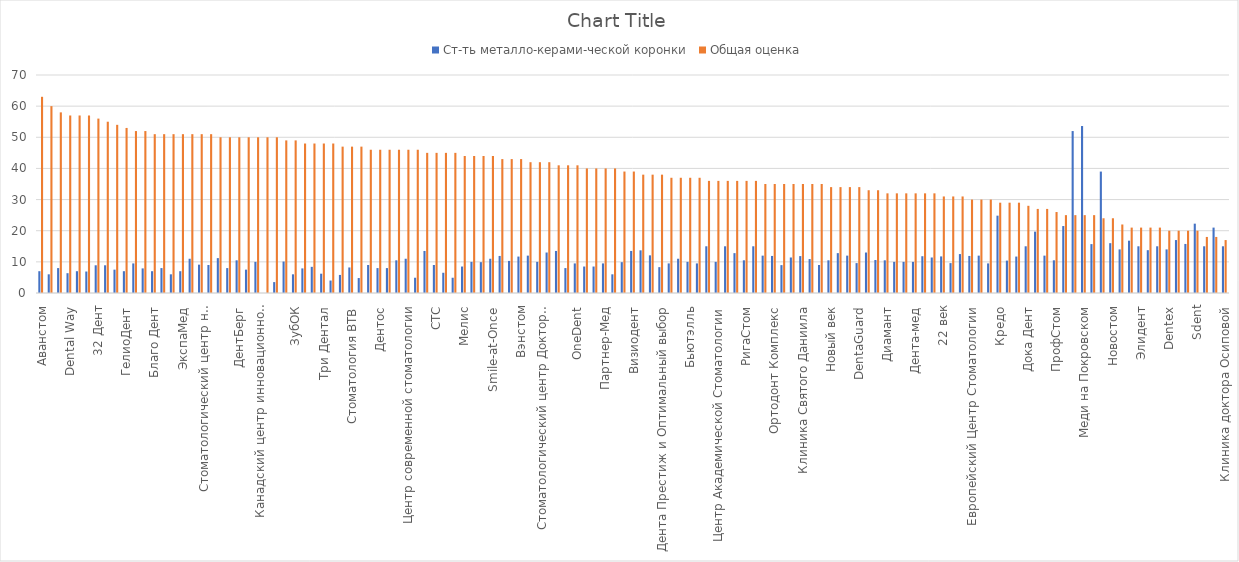
| Category | Ст-ть металло-керами-ческой коронки | Общая оценка |
|---|---|---|
| Аванстом | 7 | 63 |
| Habbydent32 | 6 | 60 |
| Smiles Clinic | 8 | 58 |
| Dental Way | 6.36 | 57 |
| Дантист | 7 | 57 |
| Добрый доктор | 6.9 | 57 |
| 32 Дент | 8.9 | 56 |
| Implant City | 8.9 | 55 |
| Дента Лэнд | 7.5 | 54 |
| ГелиоДент | 7 | 53 |
| Менделеев | 9.5 | 52 |
| С вами доктор на Киевской | 7.9 | 52 |
| Благо Дент | 7 | 51 |
| Зууб.рф | 8 | 51 |
| Стомат-Эффект | 6 | 51 |
| ЭкспаМед | 7 | 51 |
| Инновационный центр клинической стоматологии "Дежавю" | 11 | 51 |
| Art Dental Clinic | 9.1 | 51 |
| Стоматологический центр на Серпуховской | 9 | 51 |
| Дентастиль | 11.2 | 50 |
| Доктор Маг | 8 | 50 |
| ДентБерг | 10.5 | 50 |
| Старс Дентал | 7.5 | 50 |
| ЛюмиДЕНТ | 10 | 50 |
| Канадский центр инновационной стоматологии и косметологии | 0 | 50 |
| Институт инновационной медицины | 3.5 | 50 |
| НоваДент | 10.1 | 49 |
| ЗубОК | 6 | 49 |
| Eurodent | 7.9 | 48 |
| Стомдом | 8.4 | 48 |
| Три Дентал | 6.2 | 48 |
| Ю-Дент | 4 | 48 |
| Эстетикс | 5.8 | 47 |
| Стоматология ВТВ | 8.2 | 47 |
| DentoLux | 4.8 | 47 |
| Ideal-C | 9 | 46 |
| Дентос | 8 | 46 |
| Дент-АБ | 8 | 46 |
| Мелиора Дент | 10.5 | 46 |
| Центр современной стоматологии | 11 | 46 |
| Лимон | 4.9 | 46 |
| Зуб.ру | 13.5 | 45 |
| СТС | 9 | 45 |
| 33stom | 6.5 | 45 |
| Твоя стоматология | 4.9 | 45 |
| Мелис | 8.5 | 44 |
| Илатан | 10 | 44 |
| ДентаБраво | 9.9 | 44 |
| Smile-at-Once | 11 | 44 |
| Larni Clinic | 11.9 | 43 |
| Диамед | 10.3 | 43 |
| Вэнстом | 11.7 | 43 |
| ПрофиДент | 12 | 42 |
| Актокс | 10 | 42 |
| Стоматологический центр Доктора Жака | 13 | 42 |
| Инновационный центр стоматологической ассоциции России | 13.5 | 41 |
| ДентоСпас | 8 | 41 |
| OneDent | 9.5 | 41 |
| Неватекс | 8.5 | 40 |
| Amed Clinic | 8.5 | 40 |
| Партнер-Мед | 9.5 | 40 |
| Ардента | 6 | 40 |
| Эксперт | 9.9 | 39 |
| Визиодент | 13.5 | 39 |
| ДенталГуру | 13.7 | 38 |
| Ortolime | 12.09 | 38 |
| Дента Престиж и Оптимальный выбор | 8.3 | 38 |
| ИмплантЭксперт | 9.5 | 37 |
| Dentalux M | 11 | 37 |
| Бьютэлль | 10 | 37 |
| АртДент | 9.5 | 37 |
| Simpladent | 15 | 36 |
| Центр Академической Стоматологии | 10 | 36 |
| Roott | 15 | 36 |
| Специалист | 12.8 | 36 |
| РигаСтом | 10.5 | 36 |
| ПрезиДЕНТ | 15 | 36 |
| Зубная формула | 12 | 35 |
| Ортодонт Комплекс | 11.9 | 35 |
| Дентал-студио | 8.95 | 35 |
| ГалАрт | 11.4 | 35 |
| Клиника Святого Даниила | 11.85 | 35 |
| Наудент | 10.9 | 35 |
| Апекс-Д | 9 | 35 |
| Новый век | 10.5 | 34 |
| Один к одному | 12.8 | 34 |
| Доктор Лопатин | 12 | 34 |
| DentaGuard | 9.6 | 34 |
| Стелла | 13 | 33 |
| Аполлония | 10.6 | 33 |
| Диамант | 10.5 | 32 |
| Планета Детства | 10 | 32 |
| Маэп Дент+ | 10 | 32 |
| Дента-мед | 10 | 32 |
| Бест | 11.81 | 32 |
| Тридент Юг | 11.4 | 32 |
| 22 век | 11.748 | 31 |
| Art Dent | 9.6 | 31 |
| Дентал Мир | 12.5 | 31 |
| Европейский Центр Стоматологии | 11.9 | 30 |
| GrinaDENT | 12 | 30 |
| UNAmed | 9.5 | 30 |
| Кредо | 24.833 | 29 |
| New Smile | 10.4 | 29 |
| Dr.Protezist | 11.7 | 29 |
| Дока Дент | 15 | 28 |
| Альфа-Клиник | 19.7 | 27 |
| JazzDent | 12 | 27 |
| ПрофСтом | 10.5 | 26 |
| Aesthetica | 21.5 | 25 |
| Немецкая стоматология доктора Гроссманна | 52 | 25 |
| Меди на Покровском | 53.615 | 25 |
| Dental Daimond | 15.7 | 25 |
| Belgravia Dental Studio | 38.99 | 24 |
| Новостом | 16 | 24 |
| Май | 14 | 22 |
| СМ-Стоматология | 16.8 | 21 |
| Элидент | 15 | 21 |
| Сервантес | 13.75 | 21 |
| Инновационный имплантологический центр | 15 | 21 |
| Dentex | 14 | 20 |
| Smile Dent | 17 | 20 |
| Лафатер | 15.75 | 20 |
| Sdent | 22.264 | 20 |
| ПРОФИ-Дент | 15 | 18 |
| Кавитрон | 21 | 18 |
| Клиника доктора Осиповой | 15 | 17 |